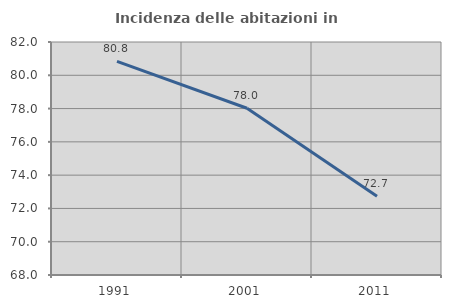
| Category | Incidenza delle abitazioni in proprietà  |
|---|---|
| 1991.0 | 80.831 |
| 2001.0 | 78.018 |
| 2011.0 | 72.733 |